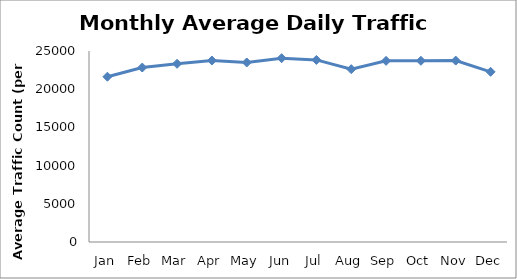
| Category | Series 0 |
|---|---|
| Jan | 21634 |
| Feb | 22838.25 |
| Mar | 23324.25 |
| Apr | 23755 |
| May | 23495.5 |
| Jun | 24059.5 |
| Jul | 23832.5 |
| Aug | 22622.25 |
| Sep | 23712.5 |
| Oct | 23719 |
| Nov | 23745.5 |
| Dec | 22273.25 |